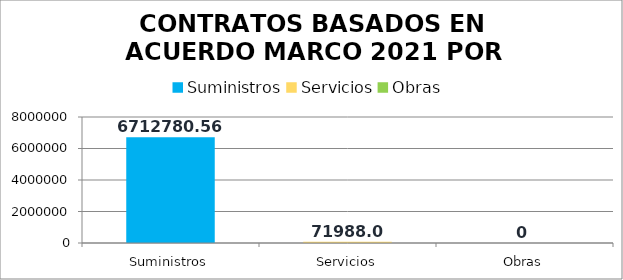
| Category | Series 0 |
|---|---|
| Suministros | 6712780.564 |
| Servicios | 71988.03 |
| Obras | 0 |